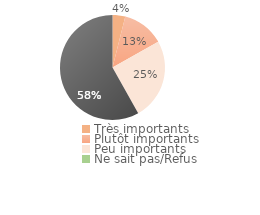
| Category | Series 0 |
|---|---|
| Très importants | 0.039 |
| Plutôt importants | 0.129 |
| Peu importants | 0.25 |
| Pas importants | 0.581 |
| Ne sait pas/Refus | 0 |